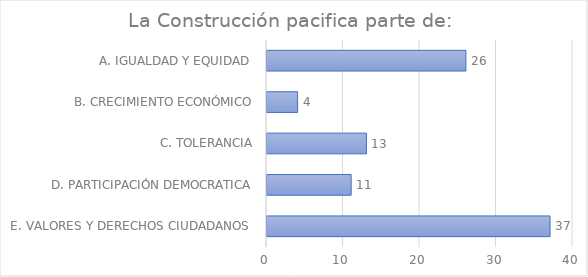
| Category | Series 0 |
|---|---|
| E. VALORES Y DERECHOS CIUDADANOS  | 37 |
| D. PARTICIPACIÓN DEMOCRATICA | 11 |
| C. TOLERANCIA | 13 |
| B. CRECIMIENTO ECONÓMICO | 4 |
| A. IGUALDAD Y EQUIDAD  | 26 |